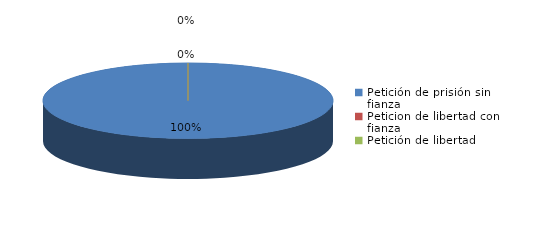
| Category | Series 0 |
|---|---|
| Petición de prisión sin fianza | 27 |
| Peticion de libertad con fianza | 0 |
| Petición de libertad | 0 |